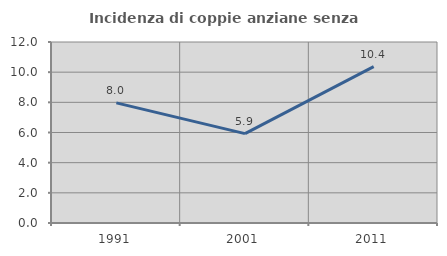
| Category | Incidenza di coppie anziane senza figli  |
|---|---|
| 1991.0 | 7.965 |
| 2001.0 | 5.926 |
| 2011.0 | 10.366 |